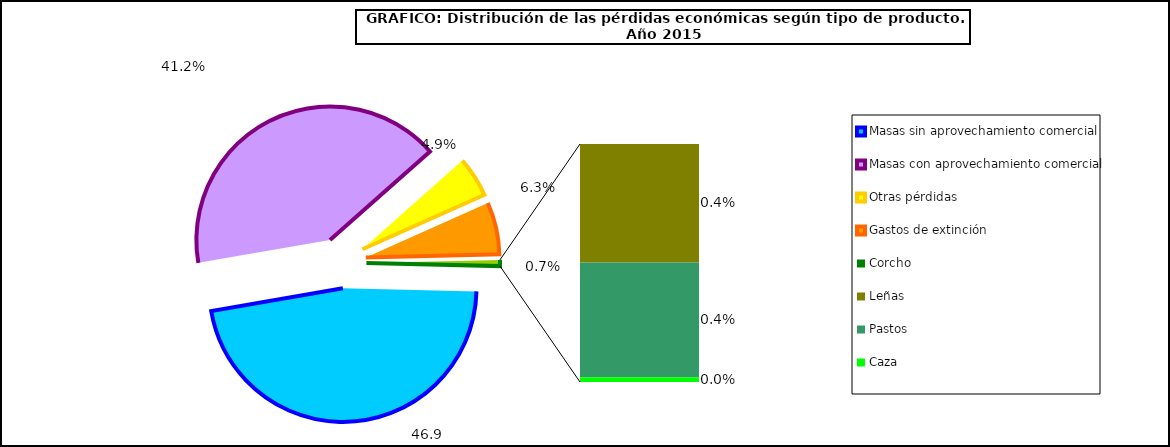
| Category | Series 0 |
|---|---|
| Masas sin aprovechamiento comercial | 46.91 |
| Masas con aprovechamiento comercial | 41.174 |
| Otras pérdidas | 4.869 |
| Gastos de extinción | 6.306 |
| Corcho | 0 |
| Leñas | 0.366 |
| Pastos | 0.355 |
| Caza | 0.015 |